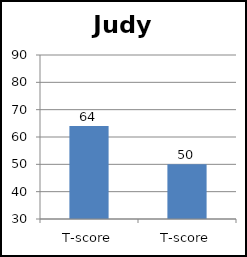
| Category | Judy |
|---|---|
| T-score | 64 |
| T-score | 50 |